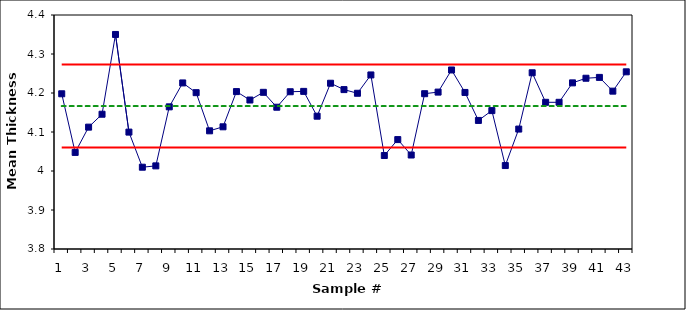
| Category | X-bar | CL | UCL | LCL |
|---|---|---|---|---|
| 1.0 | 4.198 | 4.166 | 4.273 | 4.06 |
| 2.0 | 4.048 | 4.166 | 4.273 | 4.06 |
| 3.0 | 4.112 | 4.166 | 4.273 | 4.06 |
| 4.0 | 4.146 | 4.166 | 4.273 | 4.06 |
| 5.0 | 4.35 | 4.166 | 4.273 | 4.06 |
| 6.0 | 4.1 | 4.166 | 4.273 | 4.06 |
| 7.0 | 4.01 | 4.166 | 4.273 | 4.06 |
| 8.0 | 4.013 | 4.166 | 4.273 | 4.06 |
| 9.0 | 4.164 | 4.166 | 4.273 | 4.06 |
| 10.0 | 4.226 | 4.166 | 4.273 | 4.06 |
| 11.0 | 4.201 | 4.166 | 4.273 | 4.06 |
| 12.0 | 4.103 | 4.166 | 4.273 | 4.06 |
| 13.0 | 4.113 | 4.166 | 4.273 | 4.06 |
| 14.0 | 4.204 | 4.166 | 4.273 | 4.06 |
| 15.0 | 4.182 | 4.166 | 4.273 | 4.06 |
| 16.0 | 4.202 | 4.166 | 4.273 | 4.06 |
| 17.0 | 4.164 | 4.166 | 4.273 | 4.06 |
| 18.0 | 4.203 | 4.166 | 4.273 | 4.06 |
| 19.0 | 4.204 | 4.166 | 4.273 | 4.06 |
| 20.0 | 4.141 | 4.166 | 4.273 | 4.06 |
| 21.0 | 4.225 | 4.166 | 4.273 | 4.06 |
| 22.0 | 4.209 | 4.166 | 4.273 | 4.06 |
| 23.0 | 4.199 | 4.166 | 4.273 | 4.06 |
| 24.0 | 4.246 | 4.166 | 4.273 | 4.06 |
| 25.0 | 4.04 | 4.166 | 4.273 | 4.06 |
| 26.0 | 4.081 | 4.166 | 4.273 | 4.06 |
| 27.0 | 4.041 | 4.166 | 4.273 | 4.06 |
| 28.0 | 4.198 | 4.166 | 4.273 | 4.06 |
| 29.0 | 4.202 | 4.166 | 4.273 | 4.06 |
| 30.0 | 4.259 | 4.166 | 4.273 | 4.06 |
| 31.0 | 4.201 | 4.166 | 4.273 | 4.06 |
| 32.0 | 4.13 | 4.166 | 4.273 | 4.06 |
| 33.0 | 4.155 | 4.166 | 4.273 | 4.06 |
| 34.0 | 4.014 | 4.166 | 4.273 | 4.06 |
| 35.0 | 4.107 | 4.166 | 4.273 | 4.06 |
| 36.0 | 4.252 | 4.166 | 4.273 | 4.06 |
| 37.0 | 4.176 | 4.166 | 4.273 | 4.06 |
| 38.0 | 4.176 | 4.166 | 4.273 | 4.06 |
| 39.0 | 4.226 | 4.166 | 4.273 | 4.06 |
| 40.0 | 4.238 | 4.166 | 4.273 | 4.06 |
| 41.0 | 4.24 | 4.166 | 4.273 | 4.06 |
| 42.0 | 4.205 | 4.166 | 4.273 | 4.06 |
| 43.0 | 4.254 | 4.166 | 4.273 | 4.06 |